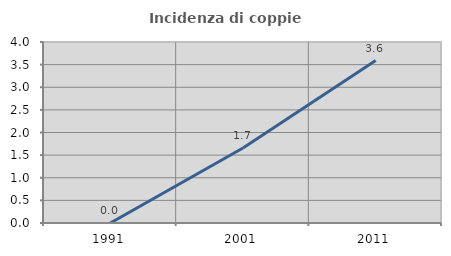
| Category | Incidenza di coppie miste |
|---|---|
| 1991.0 | 0 |
| 2001.0 | 1.657 |
| 2011.0 | 3.59 |